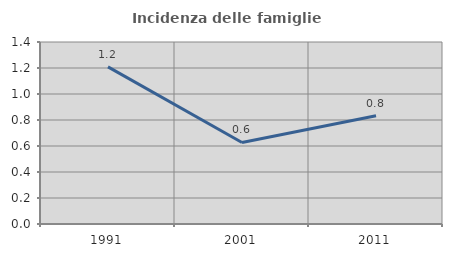
| Category | Incidenza delle famiglie numerose |
|---|---|
| 1991.0 | 1.209 |
| 2001.0 | 0.627 |
| 2011.0 | 0.832 |